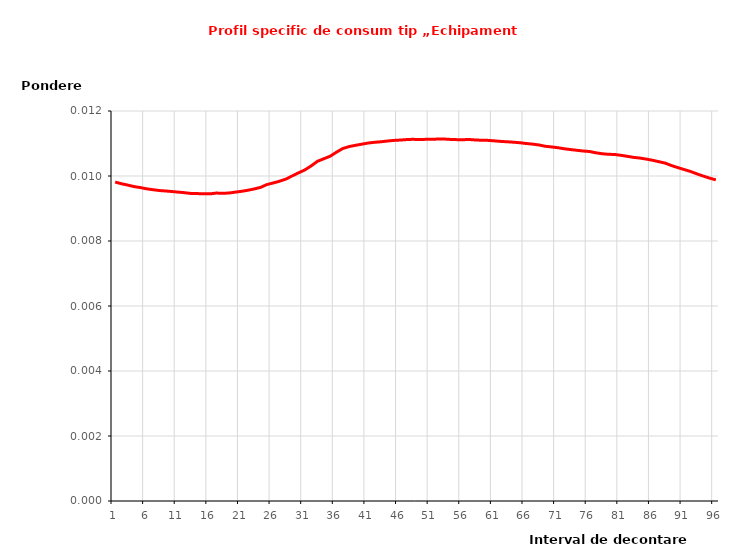
| Category | Series 0 |
|---|---|
| 1.0 | 0.01 |
| 2.0 | 0.01 |
| 3.0 | 0.01 |
| 4.0 | 0.01 |
| 5.0 | 0.01 |
| 6.0 | 0.01 |
| 7.0 | 0.01 |
| 8.0 | 0.01 |
| 9.0 | 0.01 |
| 10.0 | 0.01 |
| 11.0 | 0.01 |
| 12.0 | 0.009 |
| 13.0 | 0.009 |
| 14.0 | 0.009 |
| 15.0 | 0.009 |
| 16.0 | 0.009 |
| 17.0 | 0.009 |
| 18.0 | 0.009 |
| 19.0 | 0.009 |
| 20.0 | 0.01 |
| 21.0 | 0.01 |
| 22.0 | 0.01 |
| 23.0 | 0.01 |
| 24.0 | 0.01 |
| 25.0 | 0.01 |
| 26.0 | 0.01 |
| 27.0 | 0.01 |
| 28.0 | 0.01 |
| 29.0 | 0.01 |
| 30.0 | 0.01 |
| 31.0 | 0.01 |
| 32.0 | 0.01 |
| 33.0 | 0.01 |
| 34.0 | 0.011 |
| 35.0 | 0.011 |
| 36.0 | 0.011 |
| 37.0 | 0.011 |
| 38.0 | 0.011 |
| 39.0 | 0.011 |
| 40.0 | 0.011 |
| 41.0 | 0.011 |
| 42.0 | 0.011 |
| 43.0 | 0.011 |
| 44.0 | 0.011 |
| 45.0 | 0.011 |
| 46.0 | 0.011 |
| 47.0 | 0.011 |
| 48.0 | 0.011 |
| 49.0 | 0.011 |
| 50.0 | 0.011 |
| 51.0 | 0.011 |
| 52.0 | 0.011 |
| 53.0 | 0.011 |
| 54.0 | 0.011 |
| 55.0 | 0.011 |
| 56.0 | 0.011 |
| 57.0 | 0.011 |
| 58.0 | 0.011 |
| 59.0 | 0.011 |
| 60.0 | 0.011 |
| 61.0 | 0.011 |
| 62.0 | 0.011 |
| 63.0 | 0.011 |
| 64.0 | 0.011 |
| 65.0 | 0.011 |
| 66.0 | 0.011 |
| 67.0 | 0.011 |
| 68.0 | 0.011 |
| 69.0 | 0.011 |
| 70.0 | 0.011 |
| 71.0 | 0.011 |
| 72.0 | 0.011 |
| 73.0 | 0.011 |
| 74.0 | 0.011 |
| 75.0 | 0.011 |
| 76.0 | 0.011 |
| 77.0 | 0.011 |
| 78.0 | 0.011 |
| 79.0 | 0.011 |
| 80.0 | 0.011 |
| 81.0 | 0.011 |
| 82.0 | 0.011 |
| 83.0 | 0.011 |
| 84.0 | 0.011 |
| 85.0 | 0.011 |
| 86.0 | 0.01 |
| 87.0 | 0.01 |
| 88.0 | 0.01 |
| 89.0 | 0.01 |
| 90.0 | 0.01 |
| 91.0 | 0.01 |
| 92.0 | 0.01 |
| 93.0 | 0.01 |
| 94.0 | 0.01 |
| 95.0 | 0.01 |
| 96.0 | 0.01 |